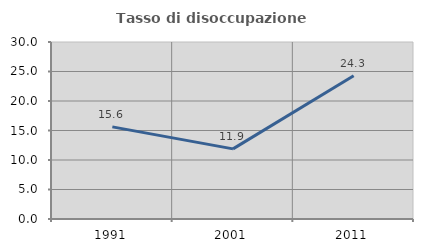
| Category | Tasso di disoccupazione giovanile  |
|---|---|
| 1991.0 | 15.611 |
| 2001.0 | 11.888 |
| 2011.0 | 24.286 |